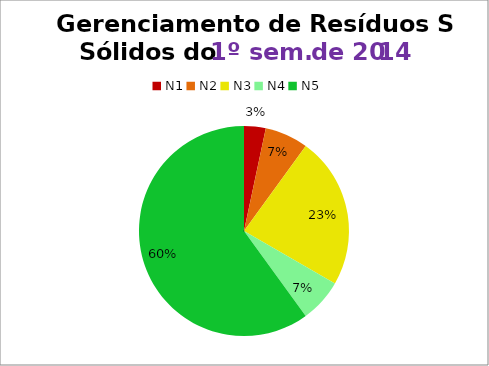
| Category | 1º/14 |
|---|---|
| N1 | 1 |
| N2 | 2 |
| N3 | 7 |
| N4 | 2 |
| N5 | 18 |